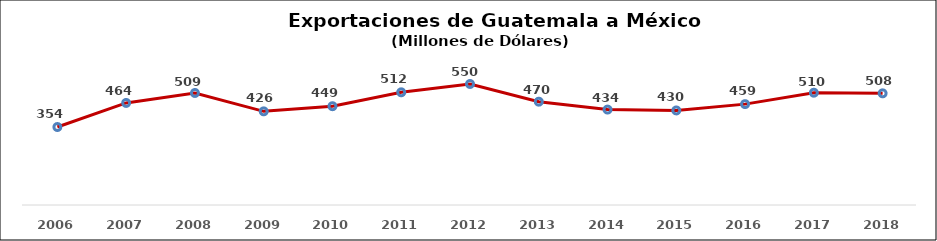
| Category | Series 0 |
|---|---|
| 2006 | 354.406 |
| 2007 | 463.947 |
| 2008 | 509.219 |
| 2009 | 425.694 |
| 2010 | 449.095 |
| 2011 | 512.254 |
| 2012 | 550.105 |
| 2013 | 469.592 |
| 2014 | 433.72 |
| 2015 | 429.806 |
| 2016 | 458.546 |
| 2017 | 510.408 |
| 2018 | 507.584 |